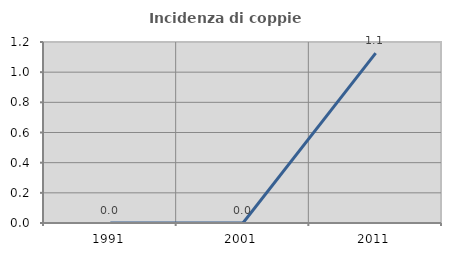
| Category | Incidenza di coppie miste |
|---|---|
| 1991.0 | 0 |
| 2001.0 | 0 |
| 2011.0 | 1.126 |